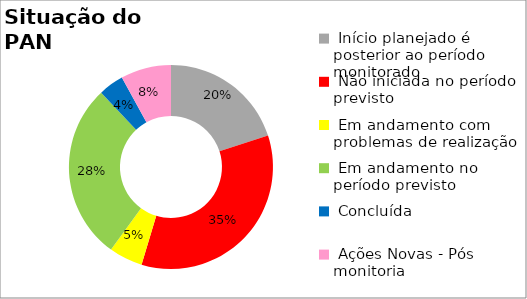
| Category | Series 0 |
|---|---|
|  Início planejado é posterior ao período monitorado | 0.2 |
|  Não iniciada no período previsto | 0.347 |
|  Em andamento com problemas de realização | 0.053 |
|  Em andamento no período previsto  | 0.28 |
|  Concluída | 0.04 |
|  Ações Novas - Pós monitoria | 0.08 |